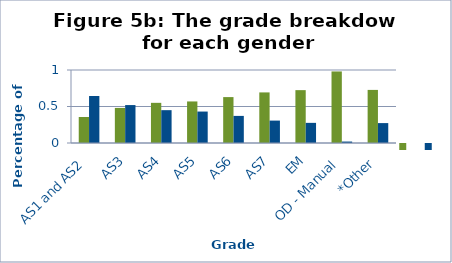
| Category | Male % | Female % |
|---|---|---|
| AS1 and AS2 | 0.356 | 0.644 |
| AS3 | 0.48 | 0.52 |
| AS4 | 0.55 | 0.45 |
| AS5 | 0.569 | 0.431 |
| AS6 | 0.629 | 0.371 |
| AS7 | 0.693 | 0.307 |
| EM | 0.724 | 0.276 |
| OD - Manual | 0.98 | 0.02 |
| *Other | 0.727 | 0.273 |